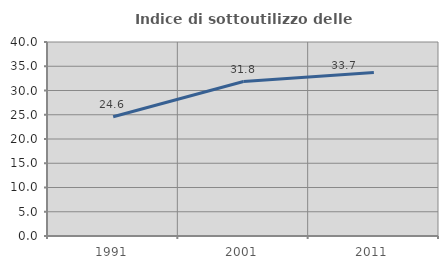
| Category | Indice di sottoutilizzo delle abitazioni  |
|---|---|
| 1991.0 | 24.581 |
| 2001.0 | 31.844 |
| 2011.0 | 33.711 |